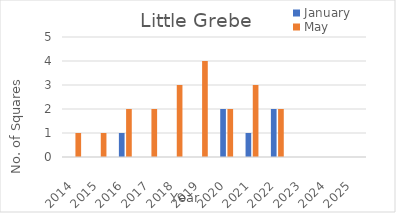
| Category | January | May |
|---|---|---|
| 2014.0 | 0 | 1 |
| 2015.0 | 0 | 1 |
| 2016.0 | 1 | 2 |
| 2017.0 | 0 | 2 |
| 2018.0 | 0 | 3 |
| 2019.0 | 0 | 4 |
| 2020.0 | 2 | 2 |
| 2021.0 | 1 | 3 |
| 2022.0 | 2 | 2 |
| 2023.0 | 0 | 0 |
| 2024.0 | 0 | 0 |
| 2025.0 | 0 | 0 |